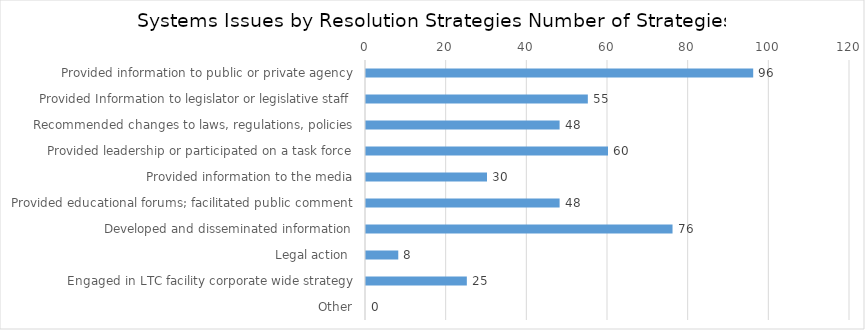
| Category | Systems issues by Resolution strategies |
|---|---|
| Provided information to public or private agency | 96 |
| Provided Information to legislator or legislative staff | 55 |
| Recommended changes to laws, regulations, policies | 48 |
| Provided leadership or participated on a task force | 60 |
| Provided information to the media | 30 |
| Provided educational forums; facilitated public comment | 48 |
| Developed and disseminated information | 76 |
| Legal action  | 8 |
| Engaged in LTC facility corporate wide strategy | 25 |
| Other | 0 |